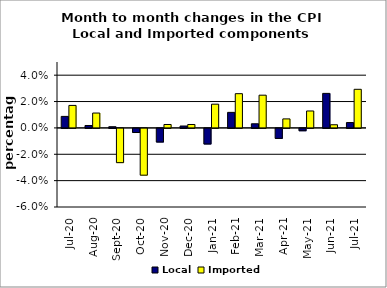
| Category | Local | Imported |
|---|---|---|
| 2020-07-01 | 0.009 | 0.017 |
| 2020-08-01 | 0.002 | 0.011 |
| 2020-09-01 | 0.001 | -0.026 |
| 2020-10-01 | -0.003 | -0.035 |
| 2020-11-01 | -0.01 | 0.003 |
| 2020-12-01 | 0.001 | 0.003 |
| 2021-01-01 | -0.012 | 0.018 |
| 2021-02-01 | 0.012 | 0.026 |
| 2021-03-01 | 0.003 | 0.025 |
| 2021-04-01 | -0.008 | 0.007 |
| 2021-05-01 | -0.002 | 0.013 |
| 2021-06-01 | 0.026 | 0.002 |
| 2021-07-01 | 0.004 | 0.029 |